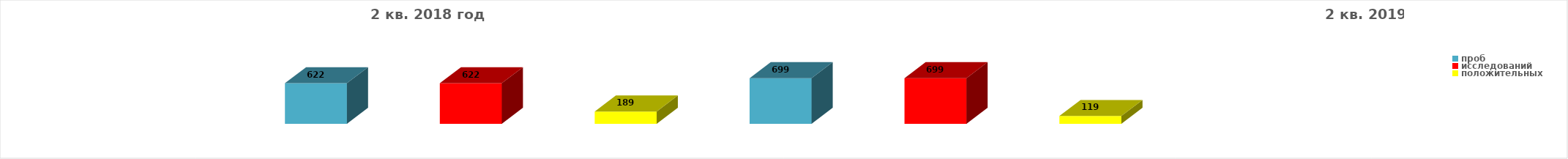
| Category | Series 4 |
|---|---|
| проб | 622 |
| исследований | 622 |
| положительных | 189 |
| проб | 699 |
| исследований | 699 |
| положительных | 119 |